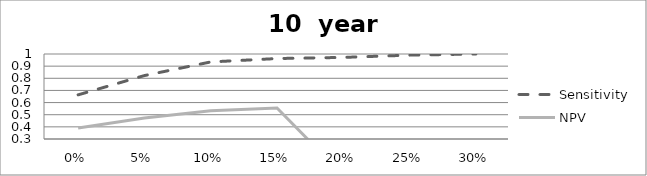
| Category | Sensitivity | NPV |
|---|---|---|
| 0.0 | 0.664 | 0.39 |
| 0.05 | 0.822 | 0.472 |
| 0.1 | 0.935 | 0.533 |
| 0.15 | 0.963 | 0.556 |
| 0.2 | 0.972 | 0 |
| 0.25 | 0.991 | 0 |
| 0.3 | 1 | 0 |